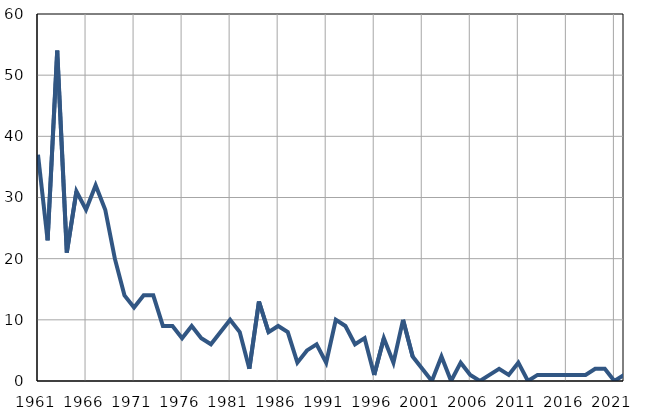
| Category | Infants
deaths |
|---|---|
| 1961.0 | 37 |
| 1962.0 | 23 |
| 1963.0 | 54 |
| 1964.0 | 21 |
| 1965.0 | 31 |
| 1966.0 | 28 |
| 1967.0 | 32 |
| 1968.0 | 28 |
| 1969.0 | 20 |
| 1970.0 | 14 |
| 1971.0 | 12 |
| 1972.0 | 14 |
| 1973.0 | 14 |
| 1974.0 | 9 |
| 1975.0 | 9 |
| 1976.0 | 7 |
| 1977.0 | 9 |
| 1978.0 | 7 |
| 1979.0 | 6 |
| 1980.0 | 8 |
| 1981.0 | 10 |
| 1982.0 | 8 |
| 1983.0 | 2 |
| 1984.0 | 13 |
| 1985.0 | 8 |
| 1986.0 | 9 |
| 1987.0 | 8 |
| 1988.0 | 3 |
| 1989.0 | 5 |
| 1990.0 | 6 |
| 1991.0 | 3 |
| 1992.0 | 10 |
| 1993.0 | 9 |
| 1994.0 | 6 |
| 1995.0 | 7 |
| 1996.0 | 1 |
| 1997.0 | 7 |
| 1998.0 | 3 |
| 1999.0 | 10 |
| 2000.0 | 4 |
| 2001.0 | 2 |
| 2002.0 | 0 |
| 2003.0 | 4 |
| 2004.0 | 0 |
| 2005.0 | 3 |
| 2006.0 | 1 |
| 2007.0 | 0 |
| 2008.0 | 1 |
| 2009.0 | 2 |
| 2010.0 | 1 |
| 2011.0 | 3 |
| 2012.0 | 0 |
| 2013.0 | 1 |
| 2014.0 | 1 |
| 2015.0 | 1 |
| 2016.0 | 1 |
| 2017.0 | 1 |
| 2018.0 | 1 |
| 2019.0 | 2 |
| 2020.0 | 2 |
| 2021.0 | 0 |
| 2022.0 | 1 |